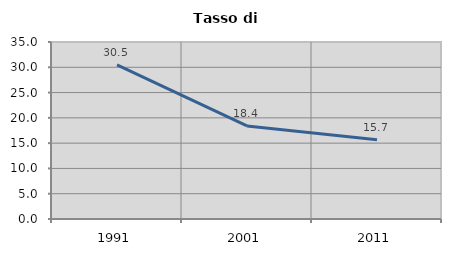
| Category | Tasso di disoccupazione   |
|---|---|
| 1991.0 | 30.473 |
| 2001.0 | 18.399 |
| 2011.0 | 15.655 |